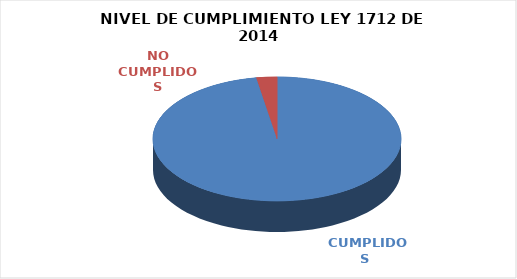
| Category | Series 0 |
|---|---|
|  CUMPLIDOS | 109 |
| NO CUMPLIDOS | 3 |